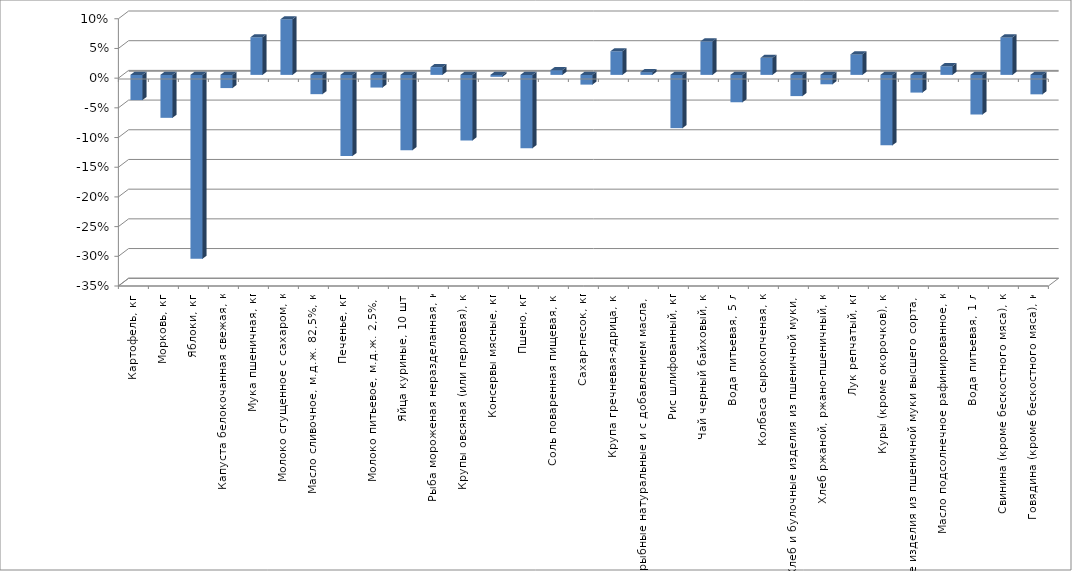
| Category | Series 0 |
|---|---|
| Картофель, кг | -0.042 |
| Морковь, кг | -0.072 |
| Яблоки, кг | -0.31 |
| Капуста белокочанная свежая, кг | -0.022 |
| Мука пшеничная, кг | 0.063 |
| Молоко сгущенное с сахаром, кг | 0.094 |
| Масло сливочное, м.д.ж. 82,5%, кг | -0.032 |
| Печенье, кг | -0.137 |
| Молоко питьевое, м.д.ж. 2,5%, л | -0.021 |
| Яйца куриные, 10 шт. | -0.127 |
| Рыба мороженая неразделанная, кг | 0.013 |
| Крупы овсяная (или перловая), кг | -0.11 |
| Консервы мясные, кг | -0.003 |
| Пшено, кг | -0.123 |
| Соль поваренная пищевая, кг | 0.008 |
| Сахар-песок, кг | -0.016 |
| Крупа гречневая-ядрица, кг | 0.04 |
| Консервы рыбные натуральные и с добавлением масла, кг | 0.005 |
| Рис шлифованный, кг | -0.09 |
| Чай черный байховый, кг | 0.056 |
| Вода питьевая, 5 л | -0.046 |
| Колбаса сырокопченая, кг | 0.029 |
| Хлеб и булочные изделия из пшеничной муки, кг | -0.036 |
| Хлеб ржаной, ржано-пшеничный, кг | -0.016 |
| Лук репчатый, кг | 0.034 |
| Куры (кроме окорочков), кг | -0.119 |
| Макаронные изделия из пшеничной муки высшего сорта, кг | -0.03 |
| Масло подсолнечное рафинированное, кг | 0.015 |
| Вода питьевая, 1 л | -0.067 |
| Свинина (кроме бескостного мяса), кг | 0.063 |
| Говядина (кроме бескостного мяса), кг | -0.033 |